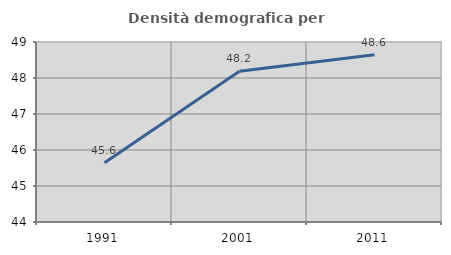
| Category | Densità demografica |
|---|---|
| 1991.0 | 45.644 |
| 2001.0 | 48.189 |
| 2011.0 | 48.648 |